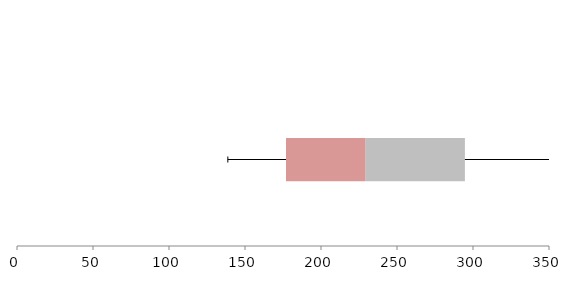
| Category | Series 1 | Series 2 | Series 3 |
|---|---|---|---|
| 0 | 176.972 | 52.405 | 65.301 |